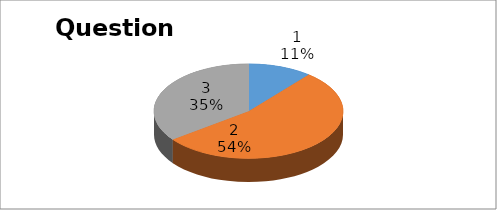
| Category | Series 0 |
|---|---|
| 0 | 23 |
| 1 | 113 |
| 2 | 74 |